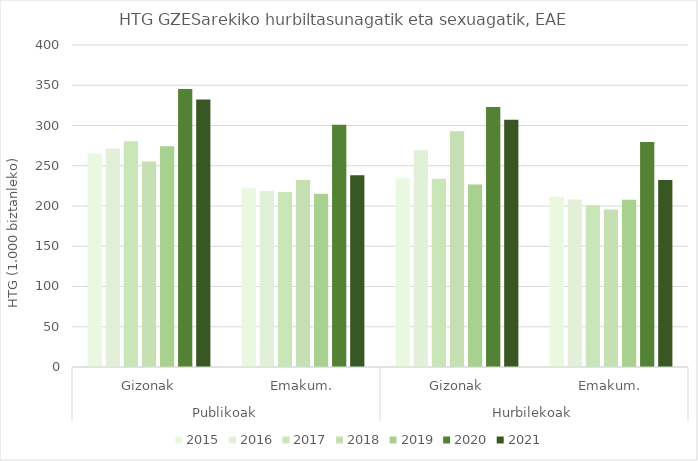
| Category | 2015 | 2016 | 2017 | 2018 | 2019 | 2020 | 2021 |
|---|---|---|---|---|---|---|---|
| 0 | 265.163 | 271.485 | 280.385 | 255.245 | 274.306 | 345.216 | 332.44 |
| 1 | 222.169 | 218.574 | 217.381 | 232.22 | 215.251 | 301.003 | 238.077 |
| 2 | 234.443 | 269.231 | 233.972 | 292.961 | 226.601 | 323.087 | 307.155 |
| 3 | 211.528 | 208.122 | 201.037 | 195.695 | 207.798 | 279.657 | 232.212 |